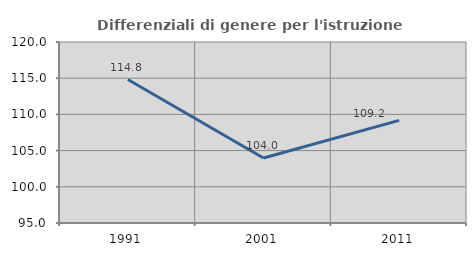
| Category | Differenziali di genere per l'istruzione superiore |
|---|---|
| 1991.0 | 114.818 |
| 2001.0 | 103.98 |
| 2011.0 | 109.174 |